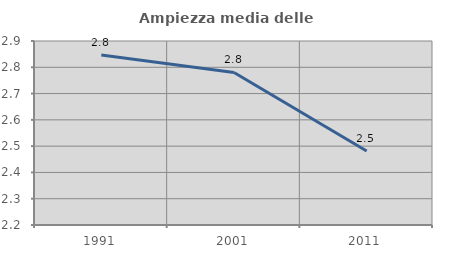
| Category | Ampiezza media delle famiglie |
|---|---|
| 1991.0 | 2.847 |
| 2001.0 | 2.78 |
| 2011.0 | 2.481 |